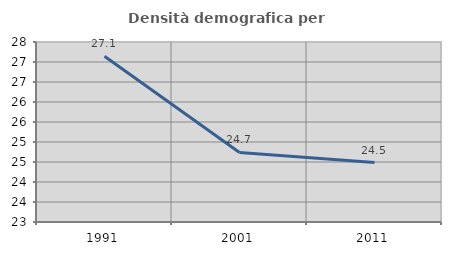
| Category | Densità demografica |
|---|---|
| 1991.0 | 27.146 |
| 2001.0 | 24.739 |
| 2011.0 | 24.486 |